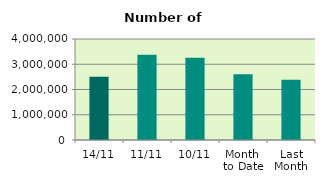
| Category | Series 0 |
|---|---|
| 14/11 | 2503882 |
| 11/11 | 3379012 |
| 10/11 | 3257748 |
| Month 
to Date | 2604137.6 |
| Last
Month | 2382963.143 |